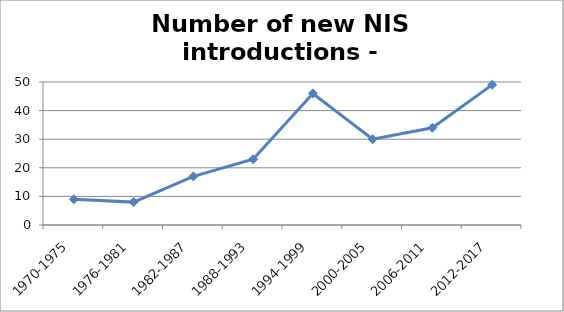
| Category | Number of new NIS introductions - Aegean-Levantine |
|---|---|
| 1970-1975 | 9 |
| 1976-1981 | 8 |
| 1982-1987 | 17 |
| 1988-1993 | 23 |
| 1994-1999 | 46 |
| 2000-2005 | 30 |
| 2006-2011 | 34 |
| 2012-2017 | 49 |